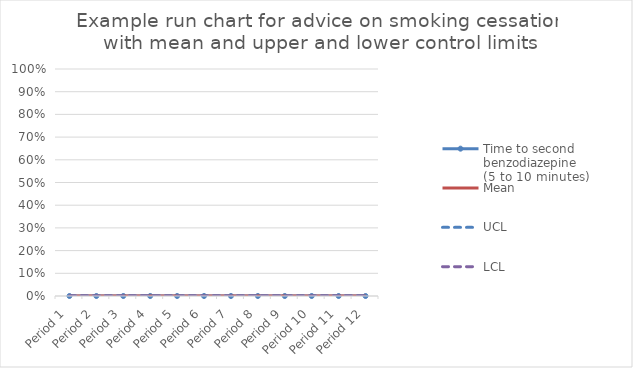
| Category | Time to second benzodiazepine
(5 to 10 minutes) | Mean | UCL | LCL |
|---|---|---|---|---|
| Period 1 | 0 | 0 | 0 | 0 |
| Period 2 | 0 | 0 | 0 | 0 |
| Period 3 | 0 | 0 | 0 | 0 |
| Period 4 | 0 | 0 | 0 | 0 |
| Period 5 | 0 | 0 | 0 | 0 |
| Period 6 | 0 | 0 | 0 | 0 |
| Period 7 | 0 | 0 | 0 | 0 |
| Period 8 | 0 | 0 | 0 | 0 |
| Period 9 | 0 | 0 | 0 | 0 |
| Period 10 | 0 | 0 | 0 | 0 |
| Period 11 | 0 | 0 | 0 | 0 |
| Period 12 | 0 | 0 | 0 | 0 |